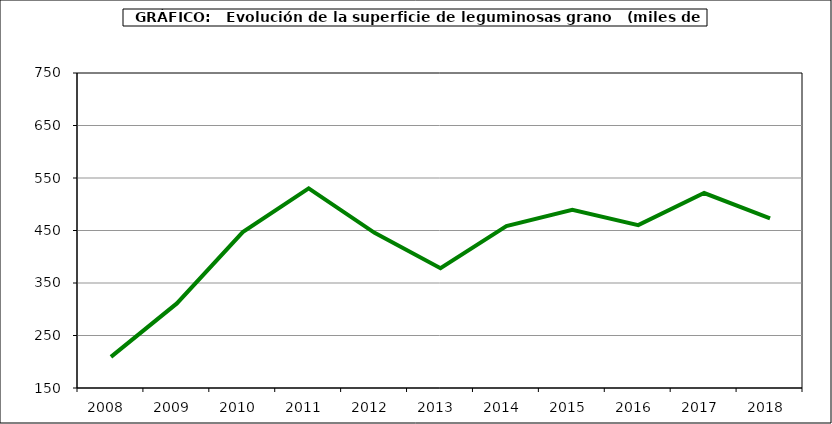
| Category | Superficie |
|---|---|
| 2008.0 | 209.361 |
| 2009.0 | 311.119 |
| 2010.0 | 446.981 |
| 2011.0 | 530.29 |
| 2012.0 | 445.63 |
| 2013.0 | 378.113 |
| 2014.0 | 458.381 |
| 2015.0 | 489.39 |
| 2016.0 | 460.227 |
| 2017.0 | 521.386 |
| 2018.0 | 472.929 |